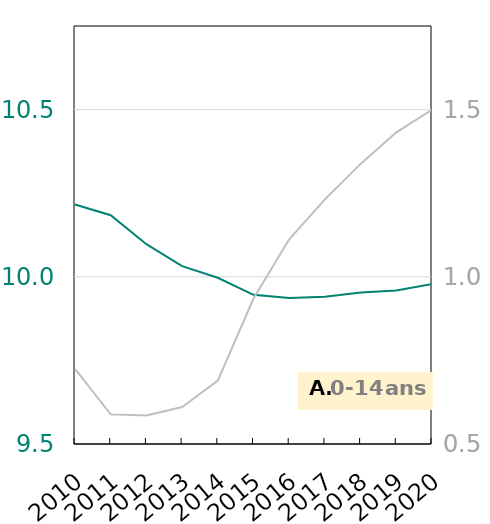
| Category | Allemande |
|---|---|
| 2010 | 10.216 |
| 2011 | 10.184 |
| 2012 | 10.097 |
| 2013 | 10.032 |
| 2014 | 9.997 |
| 2015 | 9.946 |
| 2016 | 9.937 |
| 2017 | 9.94 |
| 2018 | 9.953 |
| 2019 | 9.959 |
| 2020 | 9.978 |